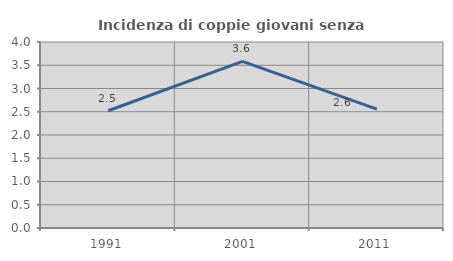
| Category | Incidenza di coppie giovani senza figli |
|---|---|
| 1991.0 | 2.521 |
| 2001.0 | 3.582 |
| 2011.0 | 2.555 |